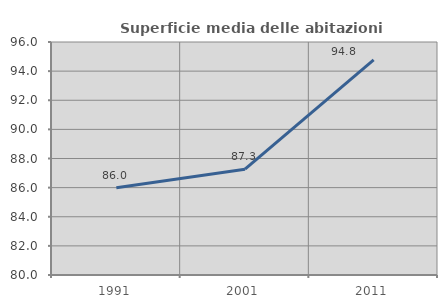
| Category | Superficie media delle abitazioni occupate |
|---|---|
| 1991.0 | 85.995 |
| 2001.0 | 87.263 |
| 2011.0 | 94.772 |